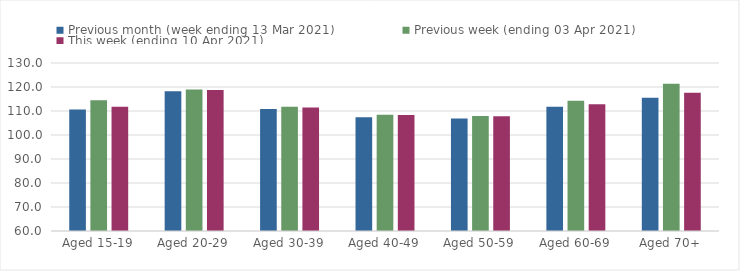
| Category | Previous month (week ending 13 Mar 2021) | Previous week (ending 03 Apr 2021) | This week (ending 10 Apr 2021) |
|---|---|---|---|
| Aged 15-19 | 110.62 | 114.47 | 111.81 |
| Aged 20-29 | 118.27 | 118.98 | 118.7 |
| Aged 30-39 | 110.79 | 111.75 | 111.45 |
| Aged 40-49 | 107.38 | 108.46 | 108.31 |
| Aged 50-59 | 106.91 | 107.94 | 107.77 |
| Aged 60-69 | 111.79 | 114.24 | 112.85 |
| Aged 70+ | 115.52 | 121.33 | 117.65 |